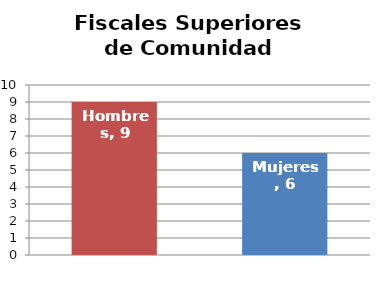
| Category | Fiscales Superiores de Comunidad Autónoma |
|---|---|
| Hombres | 9 |
| Mujeres | 6 |